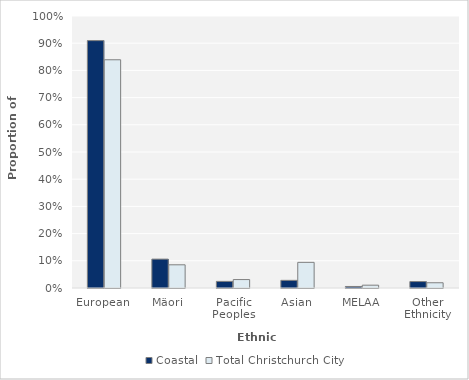
| Category | Coastal | Total Christchurch City |
|---|---|---|
| European | 0.909 | 0.839 |
| Mäori | 0.106 | 0.085 |
| Pacific Peoples | 0.024 | 0.031 |
| Asian | 0.028 | 0.094 |
| MELAA | 0.006 | 0.01 |
| Other Ethnicity | 0.024 | 0.019 |